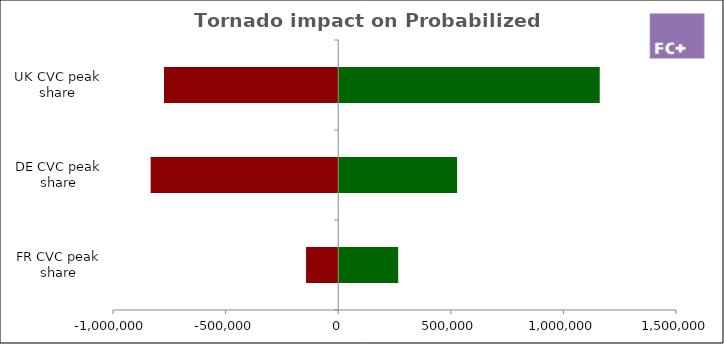
| Category | 10th to 50th | 50th to 90th |
|---|---|---|
| FR CVC peak share | -142787.002 | 266448.397 |
| DE CVC peak share | -832704.4 | 527945.997 |
| UK CVC peak share | -773437.431 | 1161280.397 |